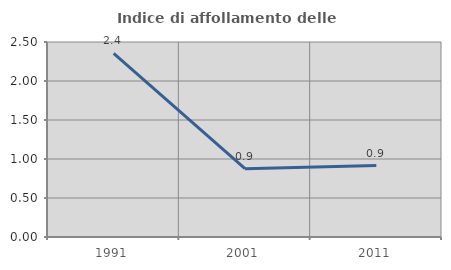
| Category | Indice di affollamento delle abitazioni  |
|---|---|
| 1991.0 | 2.353 |
| 2001.0 | 0.875 |
| 2011.0 | 0.916 |